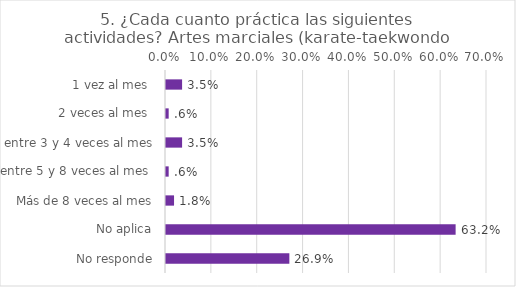
| Category | Series 0 |
|---|---|
| 1 vez al mes  | 0.035 |
| 2 veces al mes  | 0.006 |
| entre 3 y 4 veces al mes | 0.035 |
| entre 5 y 8 veces al mes  | 0.006 |
| Más de 8 veces al mes | 0.018 |
| No aplica | 0.632 |
| No responde | 0.269 |